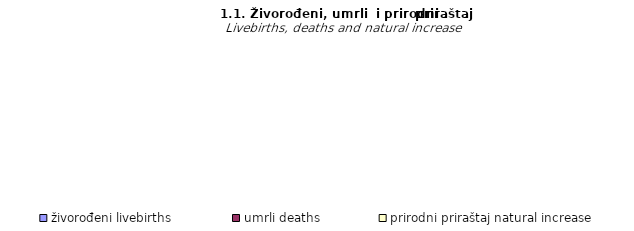
| Category | živorođeni livebirths | umrli deaths | prirodni priraštaj natural increase |
|---|---|---|---|
| VI | 1298 | 1874 | -576 |
| VII | 1372 | 1830 | -458 |
| VIII | 1443 | 1731 | -288 |
| IX | 1554 | 2187 | -633 |
| X | 1521 | 2303 | -782 |
| XI | 1352 | 2512 | -1160 |
| XII | 1605 | 2736 | -1131 |
| I/2022 | 870 | 1944 | -1074 |
| II/2022 | 1282 | 2760 | -1478 |
| III/2022 | 1380 | 2325 | -945 |
| IV/2022 | 1130 | 1714 | -584 |
| V/2022 | 1316 | 1664 | -348 |